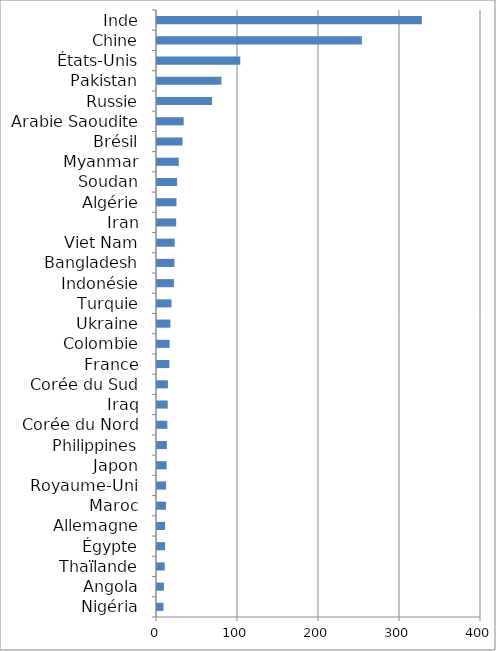
| Category | Series 0 |
|---|---|
| Nigéria | 8.028 |
| Angola | 8.545 |
| Thaïlande | 9.571 |
| Égypte | 10 |
| Allemagne | 10.004 |
| Maroc | 11.059 |
| Royaume-Uni | 11.254 |
| Japon | 11.909 |
| Philippines | 12.17 |
| Corée du Nord | 12.79 |
| Iraq | 13.22 |
| Corée du Sud | 13.461 |
| France | 15.346 |
| Colombie | 15.535 |
| Ukraine | 16.543 |
| Turquie | 17.862 |
| Indonésie | 20.869 |
| Bangladesh | 21.502 |
| Viet Nam | 21.822 |
| Iran | 23.681 |
| Algérie | 24.055 |
| Soudan | 24.846 |
| Myanmar | 26.858 |
| Brésil | 31.509 |
| Arabie Saoudite | 32.918 |
| Russie | 68.003 |
| Pakistan | 79.602 |
| États-Unis | 102.817 |
| Chine | 252.933 |
| Inde | 326.941 |